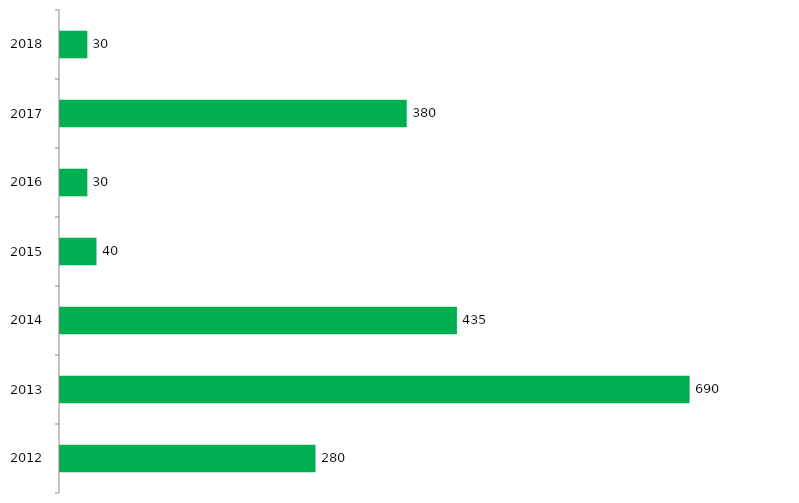
| Category | Vagas ofertadas |
|---|---|
| 2012.0 | 280 |
| 2013.0 | 690 |
| 2014.0 | 435 |
| 2015.0 | 40 |
| 2016.0 | 30 |
| 2017.0 | 380 |
| 2018.0 | 30 |